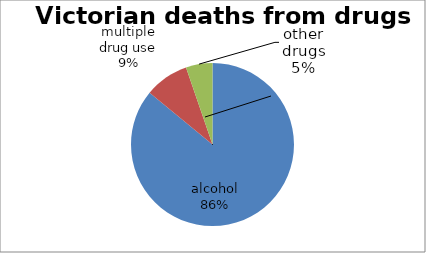
| Category | Series 0 |
|---|---|
| 0 | 49 |
| 1 | 5 |
| 2 | 3 |